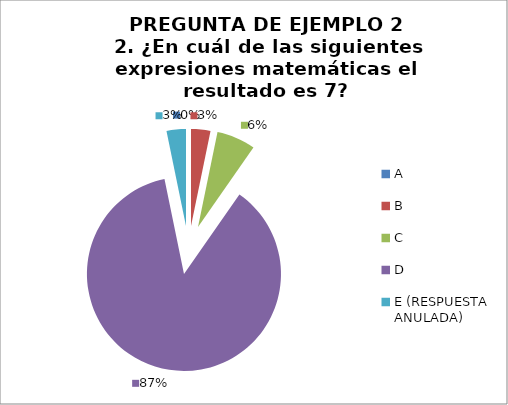
| Category | CANTIDAD DE RESPUESTAS PREGUNTA (2) | PORCENTAJE |
|---|---|---|
| A | 0 | 0 |
| B | 1 | 0.032 |
| C | 2 | 0.065 |
| D | 27 | 0.871 |
| E (RESPUESTA ANULADA) | 1 | 0.032 |